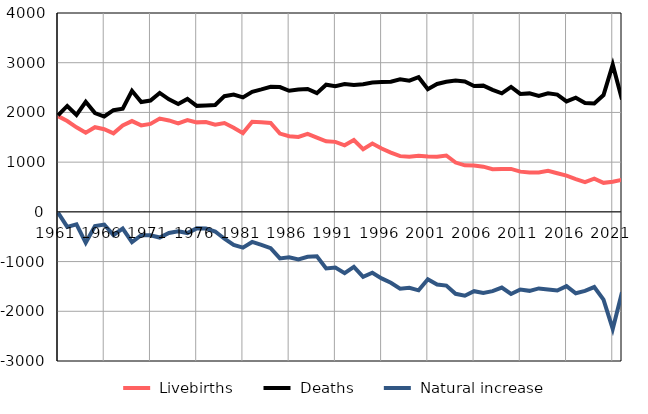
| Category |  Livebirths |  Deaths |  Natural increase |
|---|---|---|---|
| 1961.0 | 1926 | 1942 | -16 |
| 1962.0 | 1828 | 2130 | -302 |
| 1963.0 | 1701 | 1951 | -250 |
| 1964.0 | 1593 | 2215 | -622 |
| 1965.0 | 1703 | 1988 | -285 |
| 1966.0 | 1663 | 1918 | -255 |
| 1967.0 | 1580 | 2045 | -465 |
| 1968.0 | 1738 | 2075 | -337 |
| 1969.0 | 1826 | 2434 | -608 |
| 1970.0 | 1739 | 2208 | -469 |
| 1971.0 | 1770 | 2240 | -470 |
| 1972.0 | 1876 | 2392 | -516 |
| 1973.0 | 1839 | 2263 | -424 |
| 1974.0 | 1778 | 2168 | -390 |
| 1975.0 | 1846 | 2272 | -426 |
| 1976.0 | 1800 | 2132 | -332 |
| 1977.0 | 1805 | 2139 | -334 |
| 1978.0 | 1755 | 2150 | -395 |
| 1979.0 | 1787 | 2327 | -540 |
| 1980.0 | 1693 | 2360 | -667 |
| 1981.0 | 1584 | 2303 | -719 |
| 1982.0 | 1811 | 2416 | -605 |
| 1983.0 | 1800 | 2463 | -663 |
| 1984.0 | 1787 | 2516 | -729 |
| 1985.0 | 1574 | 2511 | -937 |
| 1986.0 | 1520 | 2435 | -915 |
| 1987.0 | 1507 | 2462 | -955 |
| 1988.0 | 1569 | 2473 | -904 |
| 1989.0 | 1493 | 2388 | -895 |
| 1990.0 | 1419 | 2557 | -1138 |
| 1991.0 | 1408 | 2526 | -1118 |
| 1992.0 | 1338 | 2571 | -1233 |
| 1993.0 | 1446 | 2551 | -1105 |
| 1994.0 | 1261 | 2567 | -1306 |
| 1995.0 | 1376 | 2601 | -1225 |
| 1996.0 | 1274 | 2612 | -1338 |
| 1997.0 | 1192 | 2619 | -1427 |
| 1998.0 | 1121 | 2667 | -1546 |
| 1999.0 | 1111 | 2638 | -1527 |
| 2000.0 | 1130 | 2708 | -1578 |
| 2001.0 | 1112 | 2467 | -1355 |
| 2002.0 | 1109 | 2572 | -1463 |
| 2003.0 | 1134 | 2617 | -1483 |
| 2004.0 | 992 | 2640 | -1648 |
| 2005.0 | 935 | 2621 | -1686 |
| 2006.0 | 934 | 2530 | -1596 |
| 2007.0 | 909 | 2539 | -1630 |
| 2008.0 | 858 | 2453 | -1595 |
| 2009.0 | 861 | 2384 | -1523 |
| 2010.0 | 863 | 2514 | -1651 |
| 2011.0 | 809 | 2372 | -1563 |
| 2012.0 | 794 | 2383 | -1589 |
| 2013.0 | 790 | 2330 | -1540 |
| 2014.0 | 824 | 2385 | -1561 |
| 2015.0 | 776 | 2358 | -1582 |
| 2016.0 | 728 | 2221 | -1493 |
| 2017.0 | 660 | 2297 | -1637 |
| 2018.0 | 599 | 2190 | -1591 |
| 2019.0 | 669 | 2182 | -1513 |
| 2020.0 | 584 | 2349 | -1765 |
| 2021.0 | 607 | 2961 | -2354 |
| 2022.0 | 643 | 2261 | -1618 |